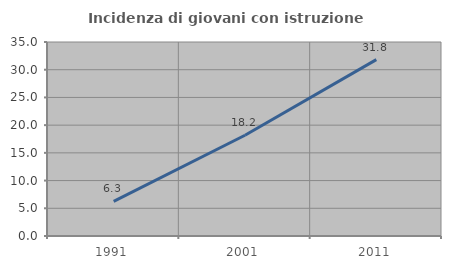
| Category | Incidenza di giovani con istruzione universitaria |
|---|---|
| 1991.0 | 6.25 |
| 2001.0 | 18.182 |
| 2011.0 | 31.818 |